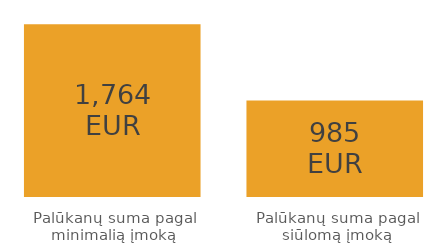
| Category | Series 0 |
|---|---|
| Palūkanų suma pagal minimalią įmoką | 1763.952 |
| Palūkanų suma pagal siūlomą įmoką | 984.811 |